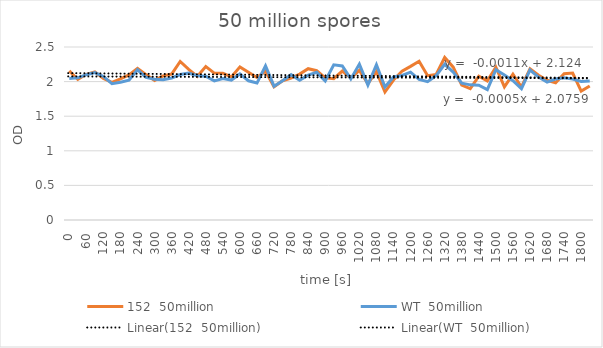
| Category | 152  50million | WT  50million |
|---|---|---|
| 0.0 | 2.155 | 2.044 |
| 30.0 | 2.031 | 2.055 |
| 60.0 | 2.105 | 2.1 |
| 90.0 | 2.14 | 2.13 |
| 120.0 | 2.045 | 2.075 |
| 150.0 | 1.988 | 1.971 |
| 180.0 | 2.04 | 1.992 |
| 210.0 | 2.097 | 2.02 |
| 240.0 | 2.192 | 2.171 |
| 270.0 | 2.101 | 2.06 |
| 300.0 | 2.017 | 2.033 |
| 330.0 | 2.083 | 2.028 |
| 360.0 | 2.109 | 2.052 |
| 390.0 | 2.291 | 2.102 |
| 420.0 | 2.177 | 2.122 |
| 450.0 | 2.074 | 2.086 |
| 480.0 | 2.218 | 2.078 |
| 510.0 | 2.123 | 2.01 |
| 540.0 | 2.121 | 2.045 |
| 570.0 | 2.067 | 2.022 |
| 600.0 | 2.213 | 2.111 |
| 630.0 | 2.135 | 2.012 |
| 660.0 | 2.06 | 1.979 |
| 690.0 | 2.15 | 2.226 |
| 720.0 | 1.926 | 1.934 |
| 750.0 | 2.013 | 2.013 |
| 780.0 | 2.049 | 2.1 |
| 810.0 | 2.108 | 2.02 |
| 840.0 | 2.186 | 2.094 |
| 870.0 | 2.157 | 2.134 |
| 900.0 | 2.055 | 2.008 |
| 930.0 | 2.043 | 2.242 |
| 960.0 | 2.153 | 2.227 |
| 990.0 | 2.053 | 2.039 |
| 1020.0 | 2.163 | 2.253 |
| 1050.0 | 1.971 | 1.951 |
| 1080.0 | 2.144 | 2.244 |
| 1110.0 | 1.849 | 1.921 |
| 1140.0 | 2.022 | 2.067 |
| 1170.0 | 2.152 | 2.089 |
| 1200.0 | 2.22 | 2.137 |
| 1230.0 | 2.294 | 2.032 |
| 1260.0 | 2.086 | 1.999 |
| 1290.0 | 2.104 | 2.087 |
| 1320.0 | 2.348 | 2.25 |
| 1350.0 | 2.209 | 2.137 |
| 1380.0 | 1.949 | 1.978 |
| 1410.0 | 1.899 | 1.953 |
| 1440.0 | 2.078 | 1.949 |
| 1470.0 | 2.01 | 1.885 |
| 1500.0 | 2.208 | 2.172 |
| 1530.0 | 1.923 | 2.094 |
| 1560.0 | 2.106 | 2.012 |
| 1590.0 | 1.922 | 1.898 |
| 1620.0 | 2.185 | 2.168 |
| 1650.0 | 2.093 | 2.065 |
| 1680.0 | 2.019 | 1.993 |
| 1710.0 | 1.984 | 2.038 |
| 1740.0 | 2.113 | 2.054 |
| 1770.0 | 2.124 | 2.036 |
| 1800.0 | 1.862 | 2.002 |
| 1830.0 | 1.936 | 2.01 |